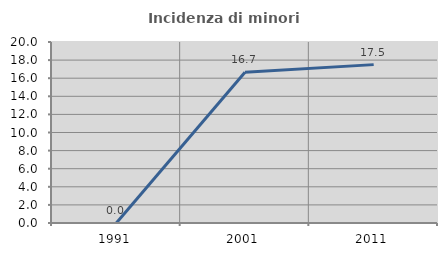
| Category | Incidenza di minori stranieri |
|---|---|
| 1991.0 | 0 |
| 2001.0 | 16.667 |
| 2011.0 | 17.5 |